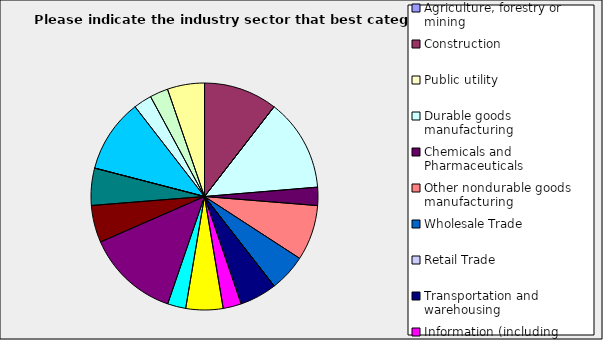
| Category | Series 0 |
|---|---|
| Agriculture, forestry or mining | 0 |
| Construction | 0.105 |
| Public utility | 0 |
| Durable goods manufacturing | 0.132 |
| Chemicals and Pharmaceuticals | 0.026 |
| Other nondurable goods manufacturing | 0.079 |
| Wholesale Trade | 0.053 |
| Retail Trade | 0 |
| Transportation and warehousing | 0.053 |
| Information (including broadcasting and telecommunication) | 0.026 |
| Finance and Insurance | 0.053 |
| Real Estate | 0.026 |
| Professional, scientific and technical services | 0.132 |
| Consulting | 0.053 |
| Administrative and office services (including waste management) | 0.053 |
| Education | 0 |
| Health Care and social services | 0.105 |
| Arts, entertainment and recreation | 0.026 |
| Accommodation and food services | 0.026 |
| Other | 0.053 |